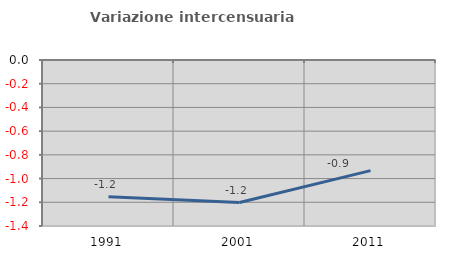
| Category | Variazione intercensuaria annua |
|---|---|
| 1991.0 | -1.154 |
| 2001.0 | -1.202 |
| 2011.0 | -0.933 |